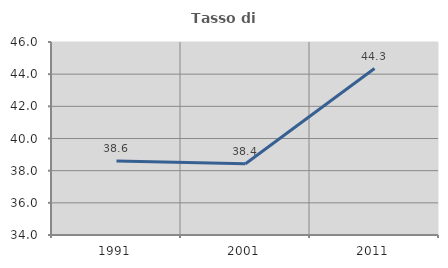
| Category | Tasso di occupazione   |
|---|---|
| 1991.0 | 38.605 |
| 2001.0 | 38.431 |
| 2011.0 | 44.348 |